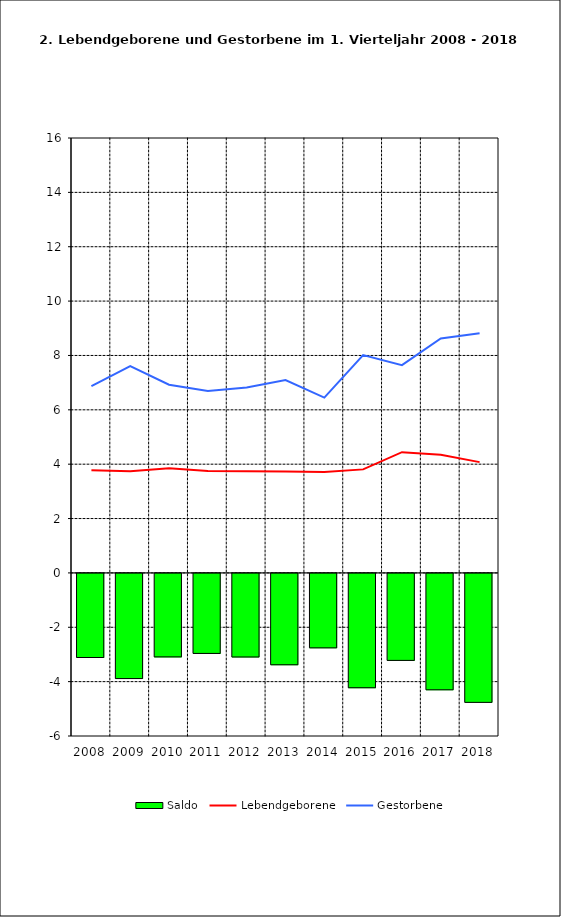
| Category | Saldo |
|---|---|
| 2005.0 | -3.094 |
| 2006.0 | -3.869 |
| 2007.0 | -3.071 |
| 2008.0 | -2.944 |
| 2009.0 | -3.075 |
| 2010.0 | -3.361 |
| 2011.0 | -2.739 |
| 2012.0 | -4.206 |
| 2013.0 | -3.2 |
| 2014.0 | -4.282 |
| 2015.0 | -4.744 |